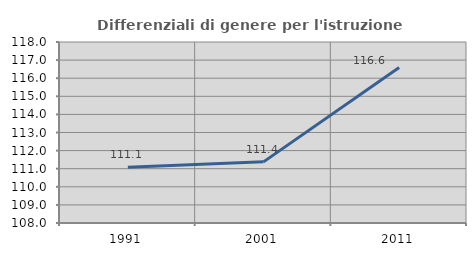
| Category | Differenziali di genere per l'istruzione superiore |
|---|---|
| 1991.0 | 111.076 |
| 2001.0 | 111.378 |
| 2011.0 | 116.595 |